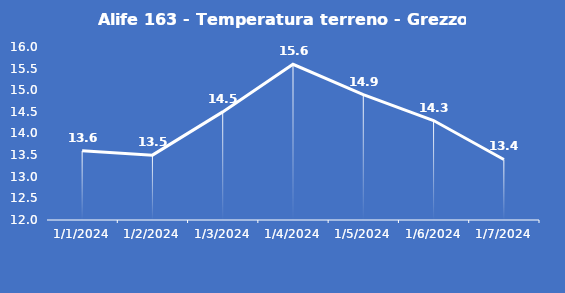
| Category | Alife 163 - Temperatura terreno - Grezzo (°C) |
|---|---|
| 1/1/24 | 13.6 |
| 1/2/24 | 13.5 |
| 1/3/24 | 14.5 |
| 1/4/24 | 15.6 |
| 1/5/24 | 14.9 |
| 1/6/24 | 14.3 |
| 1/7/24 | 13.4 |